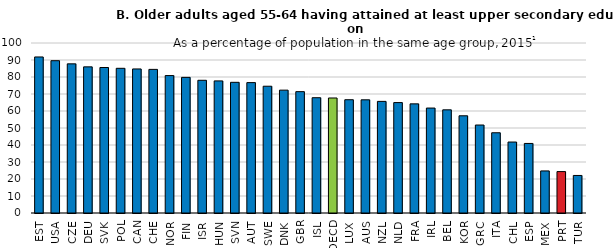
| Category | Age 55-64 |
|---|---|
| EST | 91.789 |
| USA | 89.595 |
| CZE | 87.732 |
| DEU | 85.96 |
| SVK | 85.587 |
| POL | 85.116 |
| CAN | 84.738 |
| CHE | 84.485 |
| NOR | 80.845 |
| FIN | 79.783 |
| ISR | 78.062 |
| HUN | 77.705 |
| SVN | 76.87 |
| AUT | 76.691 |
| SWE | 74.569 |
| DNK | 72.264 |
| GBR | 71.383 |
| ISL | 67.816 |
| OECD | 67.647 |
| LUX | 66.632 |
| AUS | 66.579 |
| NZL | 65.658 |
| NLD | 64.945 |
| FRA | 64.197 |
| IRL | 61.736 |
| BEL | 60.683 |
| KOR | 57.179 |
| GRC | 51.755 |
| ITA | 47.202 |
| CHL | 41.741 |
| ESP | 40.913 |
| MEX | 24.743 |
| PRT | 24.358 |
| TUR | 22.086 |